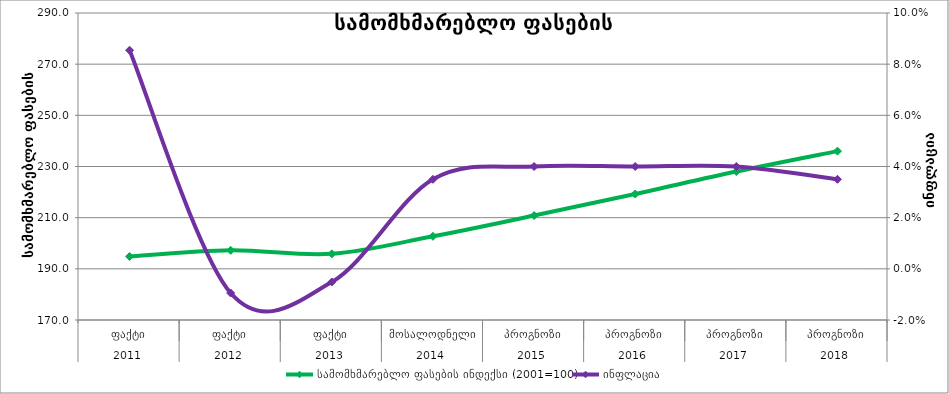
| Category | სამომხმარებლო ფასების ინდექსი (2001=100) |
|---|---|
| 0 | 194.836 |
| 1 | 197.235 |
| 2 | 195.859 |
| 3 | 202.715 |
| 4 | 210.824 |
| 5 | 219.257 |
| 6 | 228.027 |
| 7 | 236.008 |